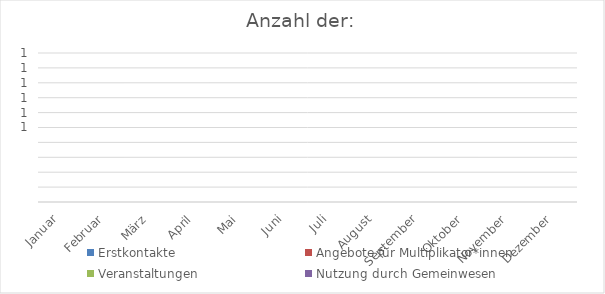
| Category | Erstkontakte | Angebote für Multiplikator*innen | Veranstaltungen | Nutzung durch Gemeinwesen |
|---|---|---|---|---|
| Januar | 0 | 0 | 0 | 0 |
| Februar | 0 | 0 | 0 | 0 |
| März | 0 | 0 | 0 | 0 |
| April | 0 | 0 | 0 | 0 |
| Mai | 0 | 0 | 0 | 0 |
| Juni | 0 | 0 | 0 | 0 |
| Juli | 0 | 0 | 0 | 0 |
| August | 0 | 0 | 0 | 0 |
| September | 0 | 0 | 0 | 0 |
| Oktober | 0 | 0 | 0 | 0 |
| November | 0 | 0 | 0 | 0 |
| Dezember | 0 | 0 | 0 | 0 |